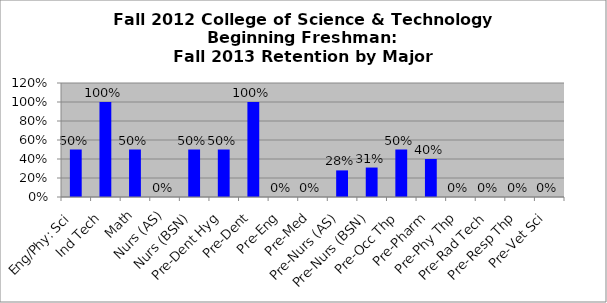
| Category | Series 0 |
|---|---|
| Eng/Phy: Sci | 0.5 |
| Ind Tech | 1 |
| Math | 0.5 |
| Nurs (AS) | 0 |
| Nurs (BSN) | 0.5 |
| Pre-Dent Hyg | 0.5 |
| Pre-Dent | 1 |
| Pre-Eng | 0 |
| Pre-Med | 0 |
| Pre-Nurs (AS) | 0.28 |
| Pre-Nurs (BSN) | 0.31 |
| Pre-Occ Thp | 0.5 |
| Pre-Pharm | 0.4 |
| Pre-Phy Thp | 0 |
| Pre-Rad Tech | 0 |
| Pre-Resp Thp | 0 |
| Pre-Vet Sci | 0 |